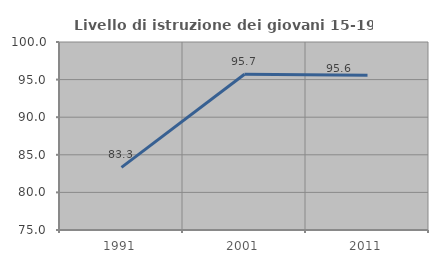
| Category | Livello di istruzione dei giovani 15-19 anni |
|---|---|
| 1991.0 | 83.333 |
| 2001.0 | 95.714 |
| 2011.0 | 95.588 |